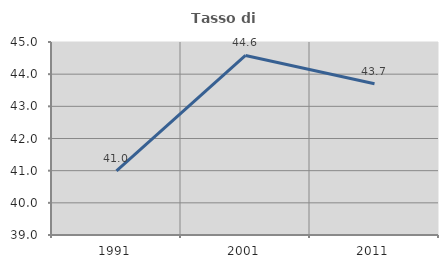
| Category | Tasso di occupazione   |
|---|---|
| 1991.0 | 40.99 |
| 2001.0 | 44.581 |
| 2011.0 | 43.704 |